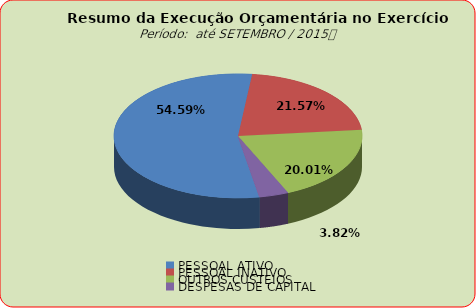
| Category | Series 0 |
|---|---|
| PESSOAL ATIVO | 93128855.44 |
| PESSOAL INATIVO | 36801452.5 |
| OUTROS CUSTEIOS | 34139925.23 |
| DESPESAS DE CAPITAL | 6514605.49 |